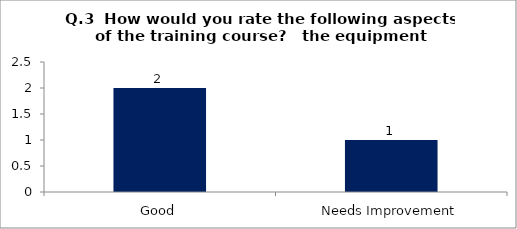
| Category | Q.3  How would you rate the following aspects of the training course?  |
|---|---|
| Good | 2 |
| Needs Improvement | 1 |